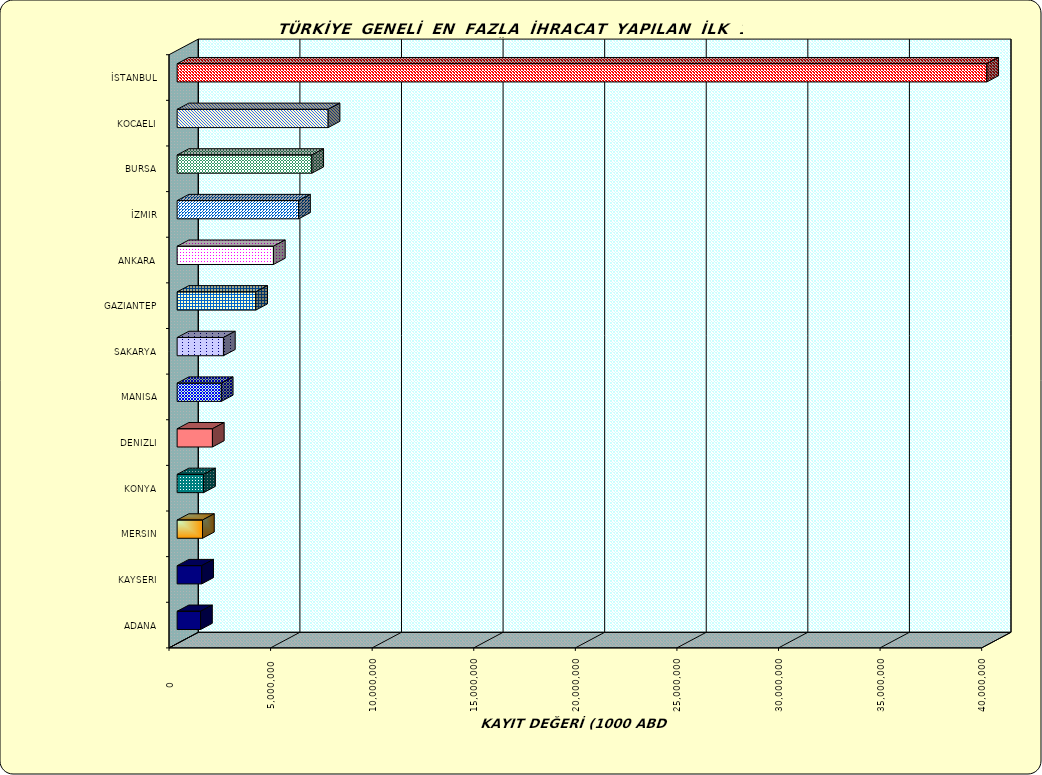
| Category | Series 0 |
|---|---|
| İSTANBUL | 39853459.315 |
| KOCAELI | 7433738.353 |
| BURSA | 6629338.826 |
| İZMIR | 5980477.904 |
| ANKARA | 4740751.496 |
| GAZIANTEP | 3871042.689 |
| SAKARYA | 2280012.511 |
| MANISA | 2175814.71 |
| DENIZLI | 1736946.084 |
| KONYA | 1304442.548 |
| MERSIN | 1249606.753 |
| KAYSERI | 1210955.205 |
| ADANA | 1154426.393 |